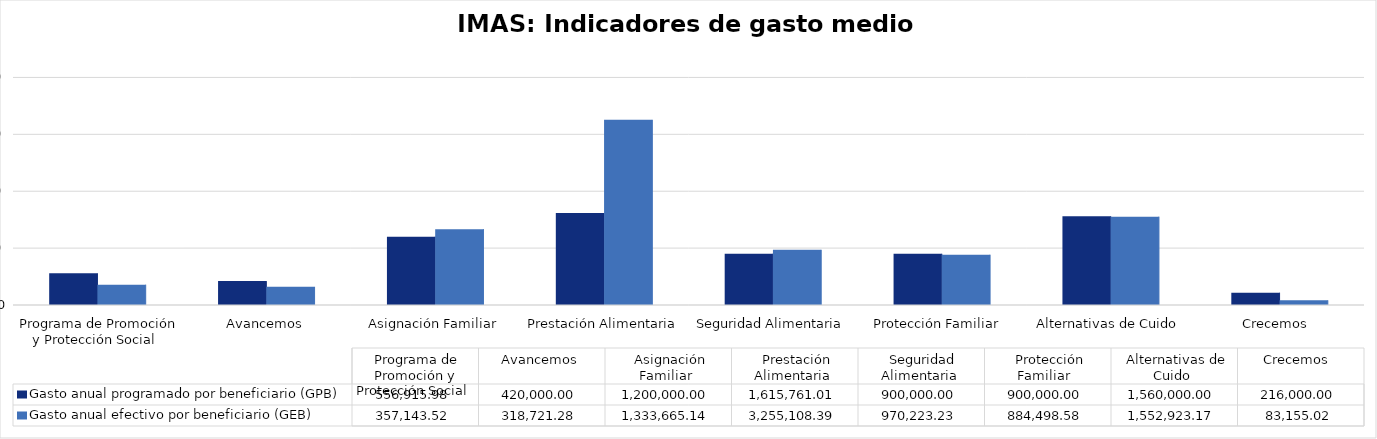
| Category |  Gasto anual programado por beneficiario (GPB)   |  Gasto anual efectivo por beneficiario (GEB)   |
|---|---|---|
|  Programa de Promoción y Protección Social  | 556915.978 | 357143.523 |
|  Avancemos  | 420000 | 318721.28 |
|  Asignación Familiar  | 1200000 | 1333665.14 |
|  Prestación Alimentaria  | 1615761.012 | 3255108.387 |
|  Seguridad Alimentaria  | 900000 | 970223.233 |
|  Protección Familiar   | 900000 | 884498.579 |
|  Alternativas de Cuido  | 1560000 | 1552923.17 |
|  Crecemos   | 216000 | 83155.018 |